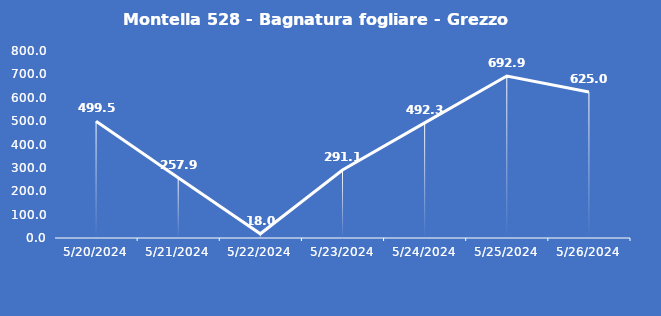
| Category | Montella 528 - Bagnatura fogliare - Grezzo (min) |
|---|---|
| 5/20/24 | 499.5 |
| 5/21/24 | 257.9 |
| 5/22/24 | 18 |
| 5/23/24 | 291.1 |
| 5/24/24 | 492.3 |
| 5/25/24 | 692.9 |
| 5/26/24 | 625 |